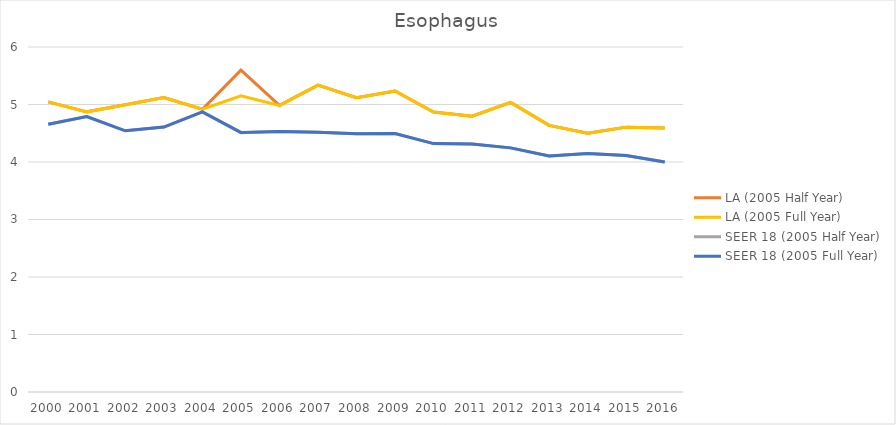
| Category | LA (2005 Half Year) | LA (2005 Full Year) | SEER 18 (2005 Half Year) | SEER 18 (2005 Full Year) |
|---|---|---|---|---|
| 2000.0 | 5.045 | 5.045 | 4.658 | 4.658 |
| 2001.0 | 4.872 | 4.872 | 4.791 | 4.791 |
| 2002.0 | 4.997 | 4.997 | 4.542 | 4.542 |
| 2003.0 | 5.121 | 5.121 | 4.608 | 4.608 |
| 2004.0 | 4.918 | 4.918 | 4.871 | 4.871 |
| 2005.0 | 5.598 | 5.15 | 4.51 | 4.515 |
| 2006.0 | 4.985 | 4.985 | 4.53 | 4.53 |
| 2007.0 | 5.338 | 5.338 | 4.519 | 4.519 |
| 2008.0 | 5.117 | 5.117 | 4.493 | 4.493 |
| 2009.0 | 5.235 | 5.235 | 4.495 | 4.495 |
| 2010.0 | 4.87 | 4.87 | 4.32 | 4.32 |
| 2011.0 | 4.798 | 4.798 | 4.312 | 4.312 |
| 2012.0 | 5.036 | 5.036 | 4.246 | 4.246 |
| 2013.0 | 4.637 | 4.637 | 4.105 | 4.105 |
| 2014.0 | 4.5 | 4.5 | 4.146 | 4.146 |
| 2015.0 | 4.606 | 4.606 | 4.113 | 4.113 |
| 2016.0 | 4.592 | 4.592 | 3.998 | 3.998 |